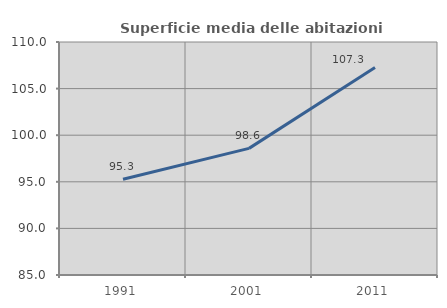
| Category | Superficie media delle abitazioni occupate |
|---|---|
| 1991.0 | 95.276 |
| 2001.0 | 98.585 |
| 2011.0 | 107.263 |